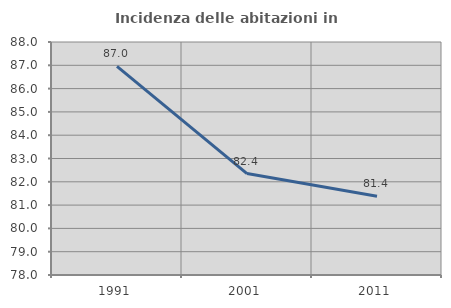
| Category | Incidenza delle abitazioni in proprietà  |
|---|---|
| 1991.0 | 86.957 |
| 2001.0 | 82.353 |
| 2011.0 | 81.379 |